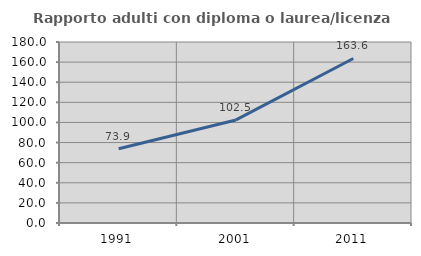
| Category | Rapporto adulti con diploma o laurea/licenza media  |
|---|---|
| 1991.0 | 73.864 |
| 2001.0 | 102.51 |
| 2011.0 | 163.636 |